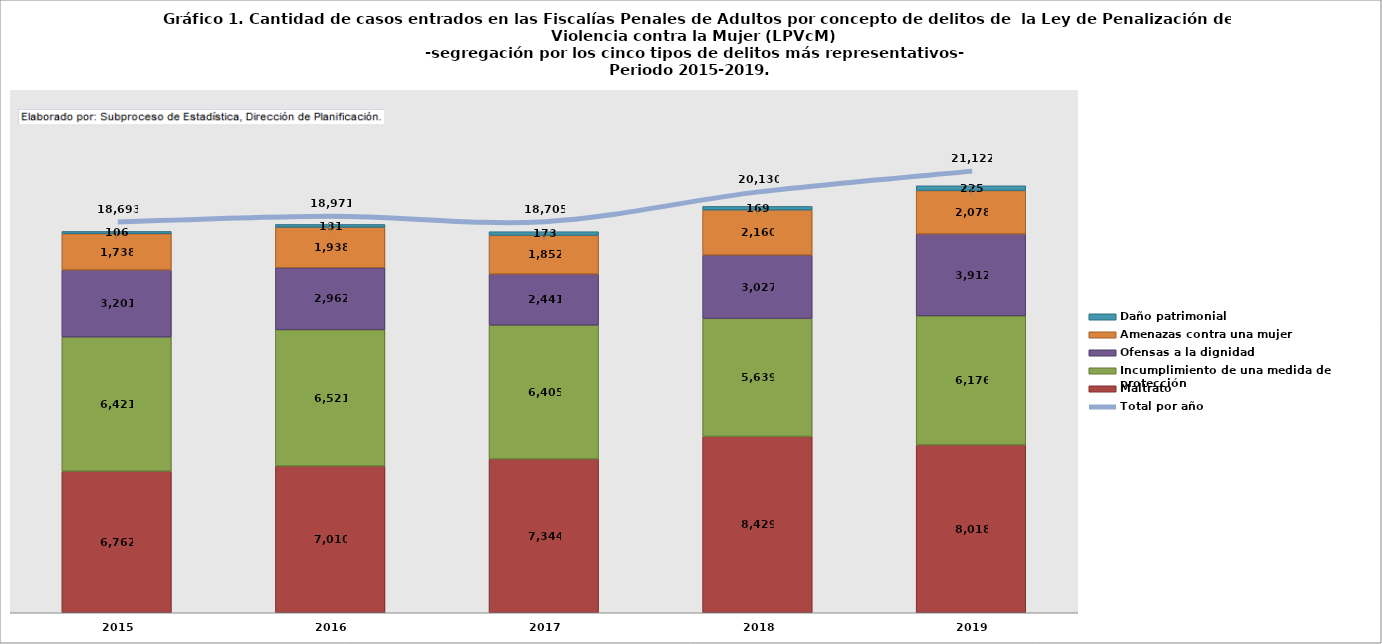
| Category | Maltrato | Incumplimiento de una medida de protección | Ofensas a la dignidad | Amenazas contra una mujer | Daño patrimonial |
|---|---|---|---|---|---|
| 2015.0 | 6762 | 6421 | 3201 | 1738 | 106 |
| 2016.0 | 7010 | 6521 | 2962 | 1938 | 131 |
| 2017.0 | 7344 | 6405 | 2441 | 1852 | 173 |
| 2018.0 | 8429 | 5639 | 3027 | 2160 | 169 |
| 2019.0 | 8018 | 6176 | 3912 | 2078 | 225 |